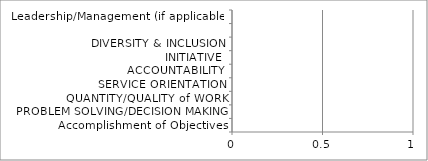
| Category | Series 0 | Series 1 |
|---|---|---|
| Accomplishment of Objectives |  | 0 |
| PROBLEM SOLVING/DECISION MAKING |  | 0 |
| QUANTITY/QUALITY of WORK |  | 0 |
| SERVICE ORIENTATION |  | 0 |
| ACCOUNTABILITY |  | 0 |
| INITIATIVE |  | 0 |
| DIVERSITY & INCLUSION |  | 0 |
|  |  | 0 |
| Leadership/Management (if applicable) |  | 0 |